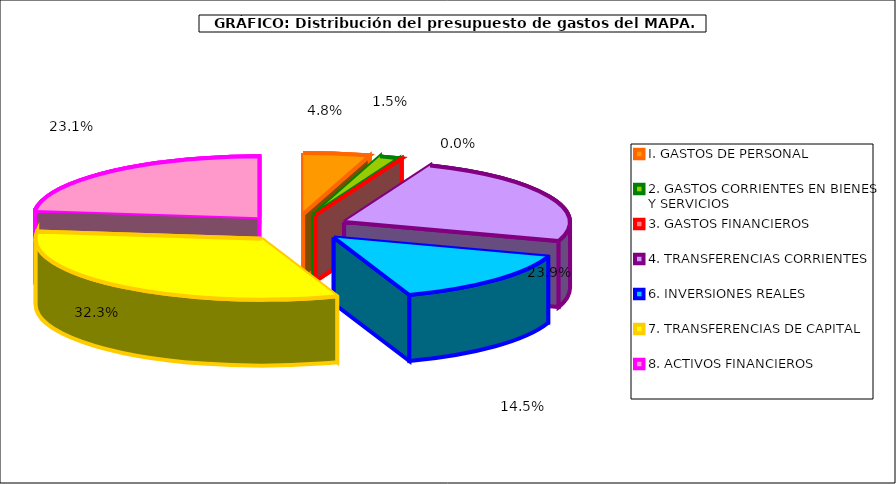
| Category | I. GASTOS DE PERSONAL |
|---|---|
| I. GASTOS DE PERSONAL | 73539.79 |
| 2. GASTOS CORRIENTES EN BIENES Y SERVICIOS | 22421.92 |
| 3. GASTOS FINANCIEROS | 39.35 |
| 4. TRANSFERENCIAS CORRIENTES | 368615.15 |
| 6. INVERSIONES REALES | 223857.21 |
| 7. TRANSFERENCIAS DE CAPITAL | 499408.88 |
| 8. ACTIVOS FINANCIEROS | 357006.3 |